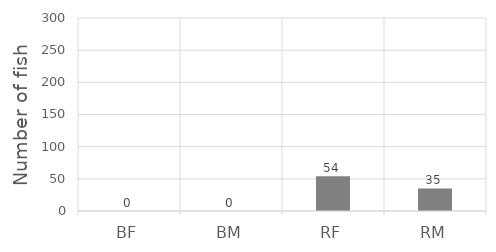
| Category | Series 0 |
|---|---|
| BF | 0 |
| BM | 0 |
| RF | 54 |
| RM | 35 |